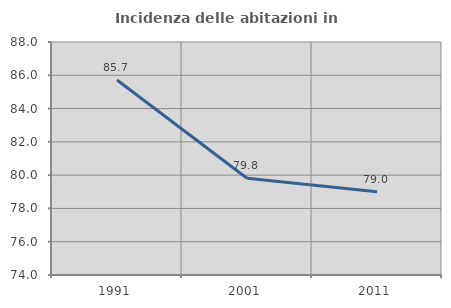
| Category | Incidenza delle abitazioni in proprietà  |
|---|---|
| 1991.0 | 85.714 |
| 2001.0 | 79.817 |
| 2011.0 | 79 |